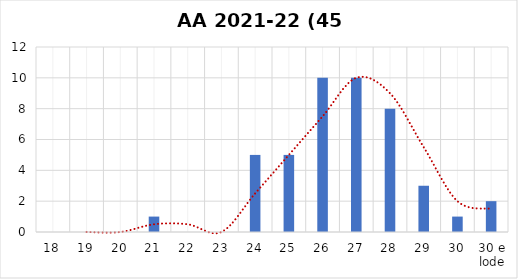
| Category | Series 0 |
|---|---|
| 18 | 0 |
| 19 | 0 |
| 20 | 0 |
| 21 | 1 |
| 22 | 0 |
| 23 | 0 |
| 24 | 5 |
| 25 | 5 |
| 26 | 10 |
| 27 | 10 |
| 28 | 8 |
| 29 | 3 |
| 30 | 1 |
| 30 e lode | 2 |